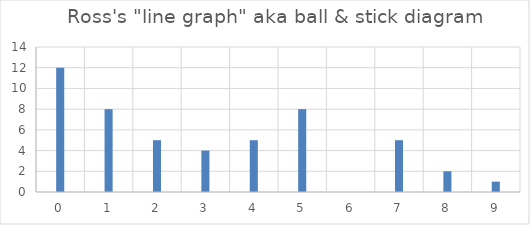
| Category | freq |
|---|---|
| 0.0 | 12 |
| 1.0 | 8 |
| 2.0 | 5 |
| 3.0 | 4 |
| 4.0 | 5 |
| 5.0 | 8 |
| 6.0 | 0 |
| 7.0 | 5 |
| 8.0 | 2 |
| 9.0 | 1 |